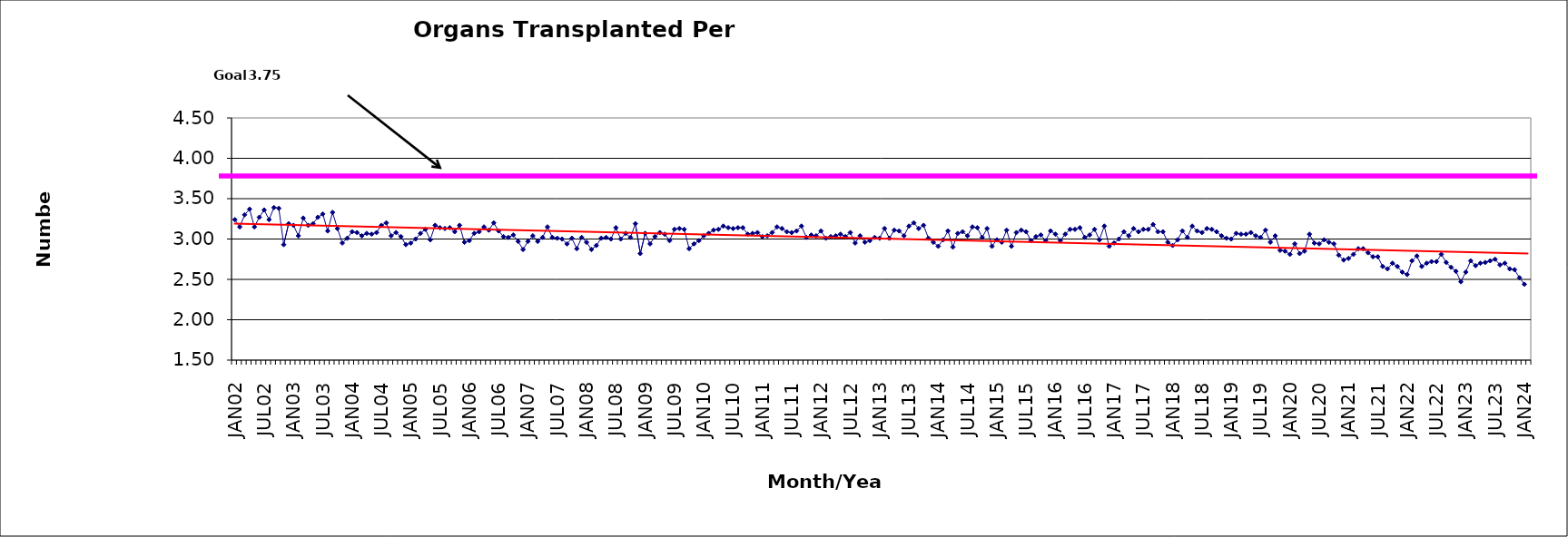
| Category | Series 0 |
|---|---|
| JAN02 | 3.24 |
| FEB02 | 3.15 |
| MAR02 | 3.3 |
| APR02 | 3.37 |
| MAY02 | 3.15 |
| JUN02 | 3.27 |
| JUL02 | 3.36 |
| AUG02 | 3.24 |
| SEP02 | 3.39 |
| OCT02 | 3.38 |
| NOV02 | 2.93 |
| DEC02 | 3.19 |
| JAN03 | 3.17 |
| FEB03 | 3.04 |
| MAR03 | 3.26 |
| APR03 | 3.17 |
| MAY03 | 3.19 |
| JUN03 | 3.27 |
| JUL03 | 3.31 |
| AUG03 | 3.1 |
| SEP03 | 3.33 |
| OCT03 | 3.13 |
| NOV03 | 2.95 |
| DEC03 | 3.01 |
| JAN04 | 3.09 |
| FEB04 | 3.08 |
| MAR04 | 3.04 |
| APR04 | 3.07 |
| MAY04 | 3.06 |
| JUN04 | 3.08 |
| JUL04 | 3.17 |
| AUG04 | 3.2 |
| SEP04 | 3.04 |
| OCT04 | 3.08 |
| NOV04 | 3.03 |
| DEC04 | 2.93 |
| JAN05 | 2.95 |
| FEB05 | 3 |
| MAR05 | 3.07 |
| APR05 | 3.12 |
| MAY05 | 2.99 |
| JUN05 | 3.17 |
| JUL05 | 3.14 |
| AUG05 | 3.13 |
| SEP05 | 3.14 |
| OCT05 | 3.09 |
| NOV05 | 3.17 |
| DEC05 | 2.96 |
| JAN06 | 2.98 |
| FEB06 | 3.07 |
| MAR06 | 3.09 |
| APR06 | 3.15 |
| MAY06 | 3.11 |
| JUN06 | 3.2 |
| JUL06 | 3.1 |
| AUG06 | 3.03 |
| SEP06 | 3.02 |
| OCT06 | 3.05 |
| NOV06 | 2.97 |
| DEC06 | 2.87 |
| JAN07 | 2.97 |
| FEB07 | 3.04 |
| MAR07 | 2.97 |
| APR07 | 3.02 |
| MAY07 | 3.15 |
| JUN07 | 3.02 |
| JUL07 | 3.01 |
| AUG07 | 3 |
| SEP07 | 2.94 |
| OCT07 | 3.01 |
| NOV07 | 2.88 |
| DEC07 | 3.02 |
| JAN08 | 2.96 |
| FEB08 | 2.87 |
| MAR08 | 2.92 |
| APR08 | 3.01 |
| MAY08 | 3.02 |
| JUN08 | 3 |
| JUL08 | 3.14 |
| AUG08 | 3 |
| SEP08 | 3.07 |
| OCT08 | 3.02 |
| NOV08 | 3.19 |
| DEC08 | 2.82 |
| JAN09 | 3.07 |
| FEB09 | 2.94 |
| MAR09 | 3.03 |
| APR09 | 3.08 |
| MAY09 | 3.06 |
| JUN09 | 2.98 |
| JUL09 | 3.12 |
| AUG09 | 3.13 |
| SEP09 | 3.12 |
| OCT09 | 2.88 |
| NOV09 | 2.94 |
| DEC09 | 2.98 |
| JAN10 | 3.04 |
| FEB10 | 3.07 |
| MAR10 | 3.11 |
| APR10 | 3.12 |
| MAY10 | 3.16 |
| JUN10 | 3.14 |
| JUL10 | 3.13 |
| AUG10 | 3.14 |
| SEP10 | 3.14 |
| OCT10 | 3.06 |
| NOV10 | 3.07 |
| DEC10 | 3.08 |
| JAN11 | 3.03 |
| FEB11 | 3.04 |
| MAR11 | 3.08 |
| APR11 | 3.15 |
| MAY11 | 3.13 |
| JUN11 | 3.09 |
| JUL11 | 3.08 |
| AUG11 | 3.1 |
| SEP11 | 3.16 |
| OCT11 | 3.02 |
| NOV11 | 3.05 |
| DEC11 | 3.04 |
| JAN12 | 3.1 |
| FEB12 | 3.01 |
| MAR12 | 3.03 |
| APR12 | 3.04 |
| MAY12 | 3.06 |
| JUN12 | 3.03 |
| JUL12 | 3.08 |
| AUG12 | 2.95 |
| SEP12 | 3.04 |
| OCT12 | 2.96 |
| NOV12 | 2.98 |
| DEC12 | 3.02 |
| JAN13 | 3.01 |
| FEB13 | 3.13 |
| MAR13 | 3.01 |
| APR13 | 3.11 |
| MAY13 | 3.1 |
| JUN13 | 3.04 |
| JUL13 | 3.16 |
| AUG13 | 3.2 |
| SEP13 | 3.13 |
| OCT13 | 3.17 |
| NOV13 | 3.01 |
| DEC13 | 2.96 |
| JAN14 | 2.91 |
| FEB14 | 2.99 |
| MAR14 | 3.1 |
| APR14 | 2.9 |
| MAY14 | 3.07 |
| JUN14 | 3.09 |
| JUL14 | 3.04 |
| AUG14 | 3.15 |
| SEP14 | 3.14 |
| OCT14 | 3.02 |
| NOV14 | 3.13 |
| DEC14 | 2.91 |
| JAN15 | 2.99 |
| FEB15 | 2.96 |
| MAR15 | 3.11 |
| APR15 | 2.91 |
| MAY15 | 3.08 |
| JUN15 | 3.11 |
| JUL15 | 3.09 |
| AUG15 | 2.98 |
| SEP15 | 3.03 |
| OCT15 | 3.05 |
| NOV15 | 2.98 |
| DEC15 | 3.1 |
| JAN16 | 3.06 |
| FEB16 | 2.98 |
| MAR16 | 3.06 |
| APR16 | 3.12 |
| MAY16 | 3.12 |
| JUN16 | 3.14 |
| JUL16 | 3.02 |
| AUG16 | 3.05 |
| SEP16 | 3.12 |
| OCT16 | 2.99 |
| NOV16 | 3.16 |
| DEC16 | 2.91 |
| JAN17 | 2.95 |
| FEB17 | 3 |
| MAR17 | 3.09 |
| APR17 | 3.04 |
| MAY17 | 3.13 |
| JUN17 | 3.09 |
| JUL17 | 3.12 |
| AUG17 | 3.12 |
| SEP17 | 3.18 |
| OCT17 | 3.09 |
| NOV17 | 3.09 |
| DEC17 | 2.96 |
| JAN18 | 2.92 |
| FEB18 | 2.99 |
| MAR18 | 3.1 |
| APR18 | 3.02 |
| MAY18 | 3.16 |
| JUN18 | 3.1 |
| JUL18 | 3.08 |
| AUG18 | 3.13 |
| SEP18 | 3.12 |
| OCT18 | 3.09 |
| NOV18 | 3.04 |
| DEC18 | 3.01 |
| JAN19 | 3 |
| FEB19 | 3.07 |
| MAR19 | 3.06 |
| APR19 | 3.06 |
| MAY19 | 3.08 |
| JUN19 | 3.04 |
| JUL19 | 3.02 |
| AUG19 | 3.11 |
| SEP19 | 2.96 |
| OCT19 | 3.04 |
| NOV19 | 2.86 |
| DEC19 | 2.85 |
| JAN20 | 2.81 |
| FEB20 | 2.94 |
| MAR20 | 2.82 |
| APR20 | 2.85 |
| MAY20 | 3.06 |
| JUN20 | 2.95 |
| JUL20 | 2.94 |
| AUG20 | 2.99 |
| SEP20 | 2.96 |
| OCT20 | 2.94 |
| NOV20 | 2.8 |
| DEC20 | 2.74 |
| JAN21 | 2.76 |
| FEB21 | 2.81 |
| MAR21 | 2.88 |
| APR21 | 2.88 |
| MAY21 | 2.83 |
| JUN21 | 2.78 |
| JUL21 | 2.78 |
| AUG21 | 2.66 |
| SEP21 | 2.63 |
| OCT21 | 2.7 |
| NOV21 | 2.66 |
| DEC21 | 2.59 |
| JAN22 | 2.56 |
| FEB22 | 2.73 |
| MAR22 | 2.79 |
| APR22 | 2.66 |
| MAY22 | 2.7 |
| JUN22 | 2.72 |
| JUL22 | 2.72 |
| AUG22 | 2.81 |
| SEP22 | 2.71 |
| OCT22 | 2.65 |
| NOV22 | 2.6 |
| DEC22 | 2.47 |
| JAN23 | 2.59 |
| FEB23 | 2.73 |
| MAR23 | 2.67 |
| APR23 | 2.7 |
| MAY23 | 2.71 |
| JUN23 | 2.73 |
| JUL23 | 2.75 |
| AUG23 | 2.68 |
| SEP23 | 2.7 |
| OCT23 | 2.63 |
| NOV23 | 2.62 |
| DEC23 | 2.52 |
| JAN24 | 2.44 |